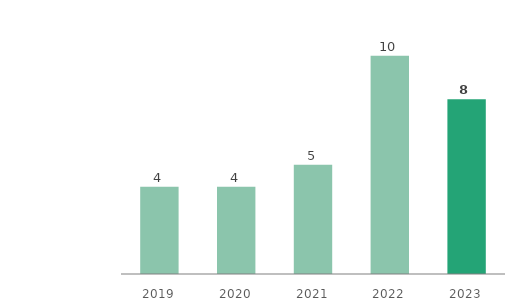
| Category | Assets in Kazakhstan |
|---|---|
| 2019.0 | 4 |
| 2020.0 | 4 |
| 2021.0 | 5 |
| 2022.0 | 10 |
| 2023.0 | 8 |